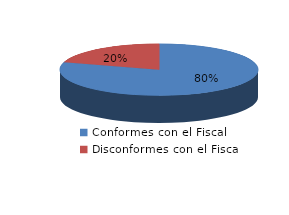
| Category | Series 0 |
|---|---|
| 0 | 6286 |
| 1 | 1600 |